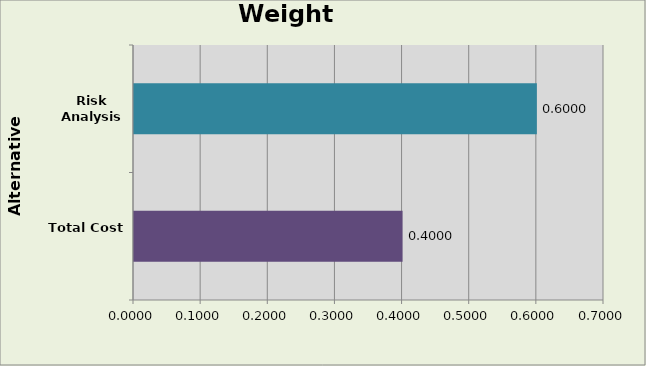
| Category | Total Cost Risk Analysis |
|---|---|
| Total Cost | 0.4 |
| Risk Analysis | 0.6 |